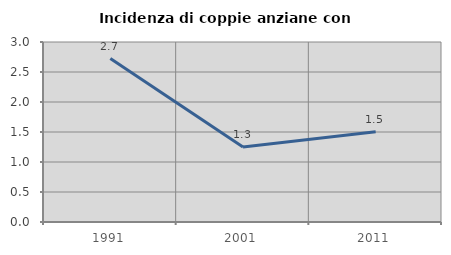
| Category | Incidenza di coppie anziane con figli |
|---|---|
| 1991.0 | 2.723 |
| 2001.0 | 1.251 |
| 2011.0 | 1.504 |